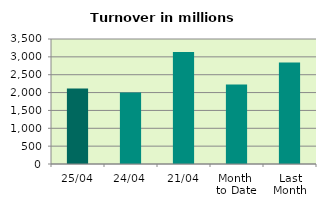
| Category | Series 0 |
|---|---|
| 25/04 | 2113.87 |
| 24/04 | 2003.024 |
| 21/04 | 3133.13 |
| Month 
to Date | 2223.797 |
| Last
Month | 2840.905 |